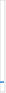
| Category | Caso | Resuelta | Pendiente |
|---|---|---|---|
| Quejas | 0 | 0 | 0 |
| Reclamaciones  | 0 | 0 | 0 |
| Sugerencias | 0 | 0 | 0 |
| Otras | 0 | 0 | 0 |
| Total | 0 | 0 | 0 |